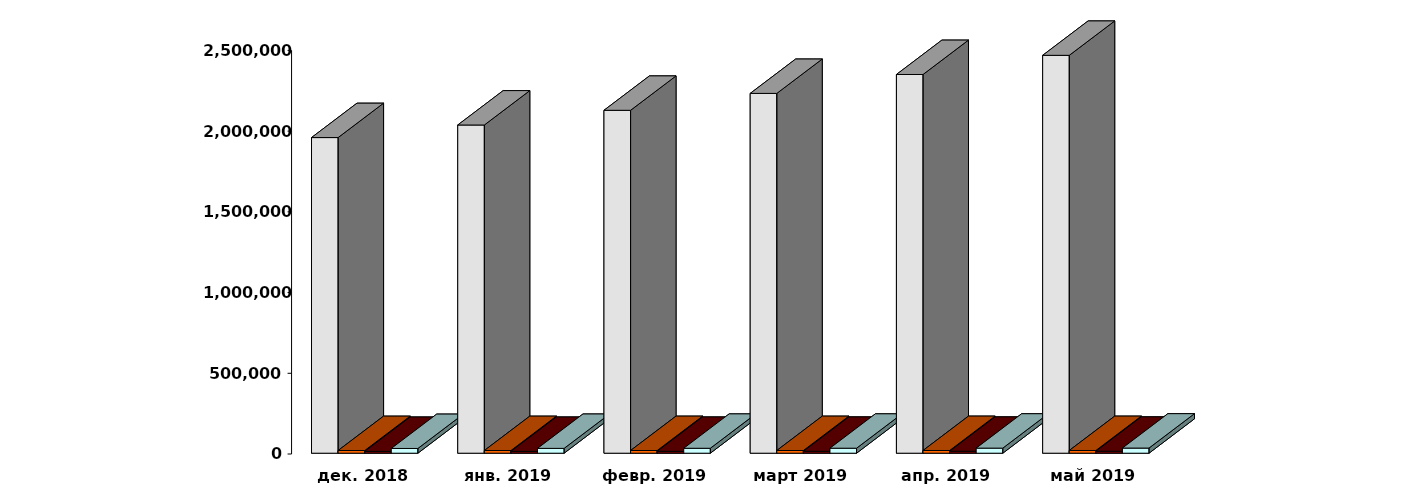
| Category | Физические лица | Юридические лица | Иностранные лица | Клиенты, передавшие свои средства в ДУ |
|---|---|---|---|---|
| 2018-12-28 | 1955118 | 16631 | 11453 | 29262 |
| 2019-01-28 | 2032931 | 16590 | 11564 | 29851 |
| 2019-02-28 | 2124042 | 16658 | 11740 | 30559 |
| 2019-03-30 | 2228680 | 16743 | 11947 | 30898 |
| 2019-04-30 | 2345873 | 16794 | 12185 | 31398 |
| 2019-05-30 | 2464521 | 16758 | 12375 | 31803 |